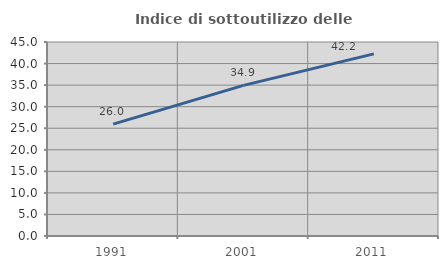
| Category | Indice di sottoutilizzo delle abitazioni  |
|---|---|
| 1991.0 | 25.952 |
| 2001.0 | 34.931 |
| 2011.0 | 42.237 |